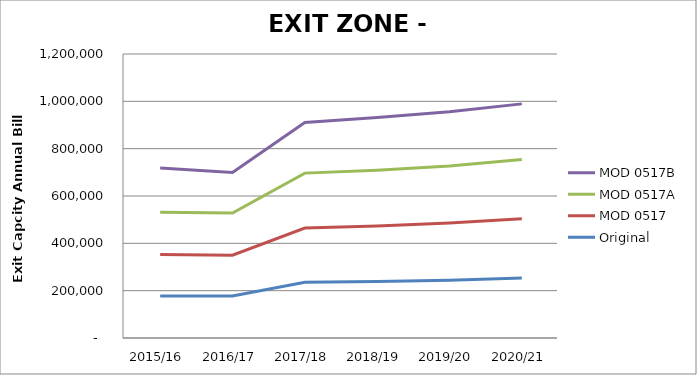
| Category | Original | MOD 0517 | MOD 0517A | MOD 0517B |
|---|---|---|---|---|
| 2015/16 | 177943.906 | 174927.907 | 177943.906 | 186991.901 |
| 2016/17 | 177943.906 | 171911.909 | 177943.906 | 171911.909 |
| 2017/18 | 235247.875 | 229215.878 | 232231.877 | 214135.886 |
| 2018/19 | 238263.874 | 235247.875 | 235247.875 | 223183.882 |
| 2019/20 | 244295.87 | 241279.872 | 241279.872 | 229215.878 |
| 2020/21 | 253343.866 | 250327.867 | 250327.867 | 235247.875 |